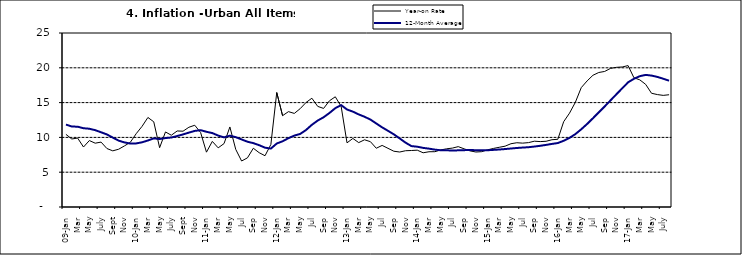
| Category | Year-on Rate | 12-Month Average |
|---|---|---|
| 09-Jan | 10.439 | 11.844 |
| Feb | 9.772 | 11.562 |
| Mar | 9.907 | 11.538 |
| Apr | 8.618 | 11.319 |
| May | 9.547 | 11.246 |
| June | 9.17 | 11.039 |
| July | 9.325 | 10.738 |
| Aug | 8.401 | 10.424 |
| Sept | 8.07 | 9.973 |
| Oct | 8.3 | 9.535 |
| Nov | 8.781 | 9.278 |
| Dec | 9.298 | 9.117 |
| 10-Jan | 10.534 | 9.136 |
| Feb | 11.584 | 9.297 |
| Mar | 12.864 | 9.555 |
| Apr | 12.24 | 9.859 |
| May | 8.524 | 9.769 |
| June | 10.781 | 9.904 |
| July | 10.313 | 9.987 |
| Aug | 10.924 | 10.197 |
| Sept | 10.891 | 10.43 |
| Oct | 11.457 | 10.689 |
| Nov | 11.748 | 10.932 |
| Dec | 10.699 | 11.042 |
| 11-Jan | 7.878 | 10.806 |
| Feb | 9.426 | 10.623 |
| Mar | 8.498 | 10.26 |
| Apr | 9.11 | 10.005 |
| May | 11.5 | 10.249 |
| Jun | 8.278 | 10.034 |
| Jul | 6.608 | 9.711 |
| Aug | 7.061 | 9.38 |
| Sep | 8.443 | 9.178 |
| Oct | 7.802 | 8.88 |
| Nov | 7.365 | 8.525 |
| Dec | 8.993 | 8.395 |
| 12-Jan | 16.445 | 9.119 |
| Feb | 13.123 | 9.443 |
| Mar | 13.701 | 9.889 |
| Apr | 13.447 | 10.259 |
| May | 14.127 | 10.496 |
| Jun | 15.012 | 11.062 |
| Jul | 15.63 | 11.81 |
| Aug | 14.456 | 12.422 |
| Sep | 14.162 | 12.893 |
| Oct | 15.26 | 13.506 |
| Nov | 15.836 | 14.199 |
| Dec | 14.459 | 14.637 |
| 13-Jan | 9.22 | 14.006 |
| Feb | 9.85 | 13.703 |
| Mar | 9.253 | 13.302 |
| Apr | 9.657 | 12.966 |
| May | 9.385 | 12.557 |
| Jun | 8.441 | 11.999 |
| Jul | 8.849 | 11.443 |
| Aug | 8.431 | 10.946 |
| Sep | 8.013 | 10.44 |
| Oct | 7.9 | 9.849 |
| Nov | 8.086 | 9.245 |
| Dec | 8.117 | 8.75 |
| 14-Jan | 8.164 | 8.662 |
| Feb | 7.791 | 8.493 |
| Mar | 7.937 | 8.384 |
| Apr | 7.947 | 8.246 |
| May | 8.195 | 8.151 |
| Jun | 8.358 | 8.146 |
| Jul | 8.464 | 8.118 |
| Aug | 8.673 | 8.141 |
| Sep | 8.357 | 8.17 |
| Oct | 8.064 | 8.182 |
| Nov | 7.902 | 8.165 |
| Dec | 7.948 | 8.151 |
| 15-Jan | 8.211 | 8.155 |
| Feb | 8.412 | 8.206 |
| Mar | 8.579 | 8.26 |
| Apr | 8.742 | 8.326 |
| May | 9.092 | 8.403 |
| Jun | 9.232 | 8.478 |
| Jul | 9.177 | 8.54 |
| Aug | 9.25 | 8.591 |
| Sep | 9.455 | 8.684 |
| Oct | 9.398 | 8.795 |
| Nov | 9.442 | 8.922 |
| Dec | 9.665 | 9.064 |
| 16-Jan | 9.728 | 9.19 |
| Feb | 12.254 | 9.516 |
| Mar | 13.485 | 9.935 |
| Apr | 15.052 | 10.474 |
| May | 17.148 | 11.165 |
| Jun | 18.111 | 11.925 |
| Jul | 18.927 | 12.754 |
| Aug | 19.325 | 13.605 |
| Sep | 19.476 | 14.444 |
| Oct | 19.914 | 15.318 |
| Nov | 20.067 | 16.193 |
| Dec | 20.118 | 17.05 |
| 17-Jan | 20.315 | 17.914 |
| Feb | 18.569 | 18.418 |
| Mar | 18.27 | 18.794 |
| Apr | 17.621 | 18.982 |
| May | 16.343 | 18.883 |
| June | 16.153 | 18.692 |
| July | 16.038 | 18.43 |
| August | 16.128 | 18.151 |